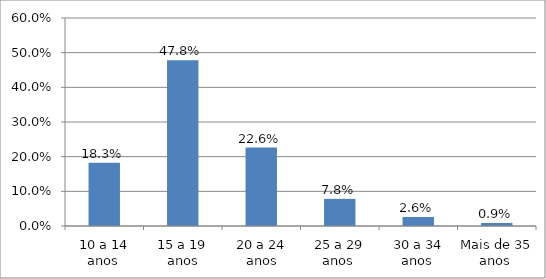
| Category | Series 0 |
|---|---|
| 10 a 14 anos  | 0.183 |
| 15 a 19 anos | 0.478 |
| 20 a 24 anos | 0.226 |
| 25 a 29 anos  | 0.078 |
| 30 a 34 anos  | 0.026 |
| Mais de 35 anos  | 0.009 |